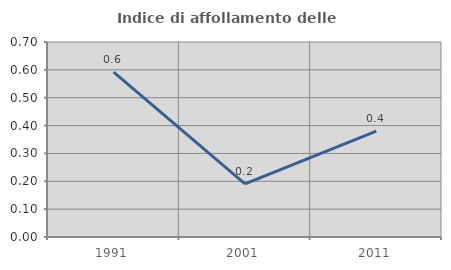
| Category | Indice di affollamento delle abitazioni  |
|---|---|
| 1991.0 | 0.592 |
| 2001.0 | 0.191 |
| 2011.0 | 0.38 |